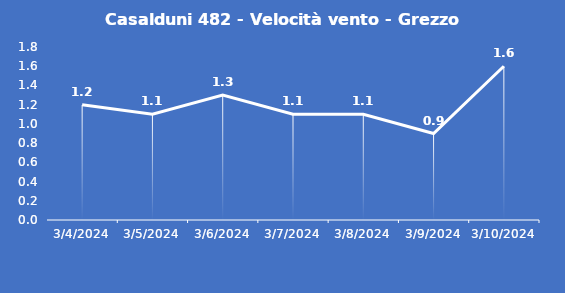
| Category | Casalduni 482 - Velocità vento - Grezzo (m/s) |
|---|---|
| 3/4/24 | 1.2 |
| 3/5/24 | 1.1 |
| 3/6/24 | 1.3 |
| 3/7/24 | 1.1 |
| 3/8/24 | 1.1 |
| 3/9/24 | 0.9 |
| 3/10/24 | 1.6 |